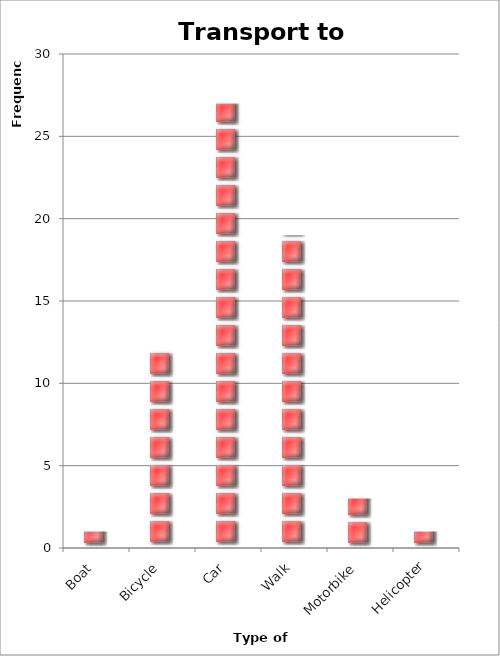
| Category | Frequency |
|---|---|
| Boat | 1 |
| Bicycle | 12 |
| Car | 27 |
| Walk | 19 |
| Motorbike | 3 |
| Helicopter | 1 |